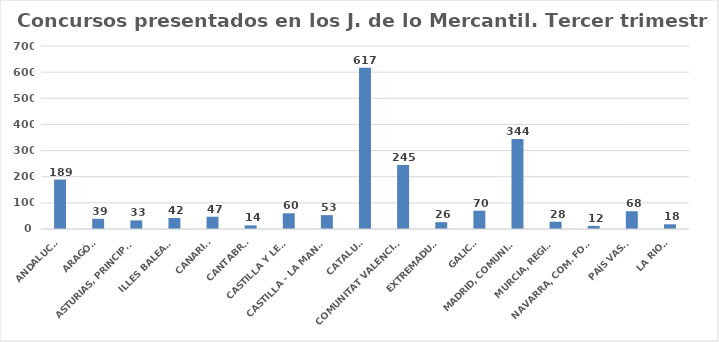
| Category | Series 0 |
|---|---|
| ANDALUCÍA | 189 |
| ARAGÓN | 39 |
| ASTURIAS, PRINCIPADO | 33 |
| ILLES BALEARS | 42 |
| CANARIAS | 47 |
| CANTABRIA | 14 |
| CASTILLA Y LEÓN | 60 |
| CASTILLA - LA MANCHA | 53 |
| CATALUÑA | 617 |
| COMUNITAT VALENCIANA | 245 |
| EXTREMADURA | 26 |
| GALICIA | 70 |
| MADRID, COMUNIDAD | 344 |
| MURCIA, REGIÓN | 28 |
| NAVARRA, COM. FORAL | 12 |
| PAÍS VASCO | 68 |
| LA RIOJA | 18 |